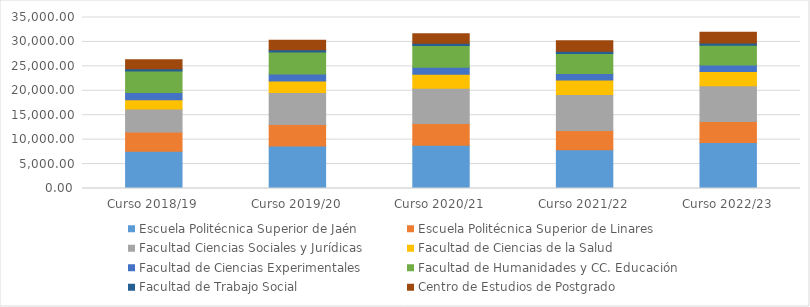
| Category | Escuela Politécnica Superior de Jaén | Escuela Politécnica Superior de Linares | Facultad Ciencias Sociales y Jurídicas | Facultad de Ciencias de la Salud | Facultad de Ciencias Experimentales | Facultad de Humanidades y CC. Educación | Facultad de Trabajo Social | Centro de Estudios de Postgrado |
|---|---|---|---|---|---|---|---|---|
| Curso 2018/19 | 7636.65 | 3914.65 | 4700.25 | 1921.4 | 1461.9 | 4412.2 | 453.95 | 1832.98 |
| Curso 2019/20 | 8702.65 | 4376.45 | 6594.83 | 2320.8 | 1439.4 | 4506.27 | 457.55 | 1961.17 |
| Curso 2020/21 | 8844.65 | 4481.1 | 7179.48 | 2866 | 1431.4 | 4485.21 | 462.05 | 1910.15 |
| Curso 2021/22 | 7915 | 3941.6 | 7392.38 | 2973.2 | 1339 | 4080.11 | 462.05 | 2128.49 |
| Curso 2022/23 | 9398.45 | 4290.4 | 7358.78 | 2902.6 | 1309.8 | 4083.78 | 460.05 | 2182.14 |